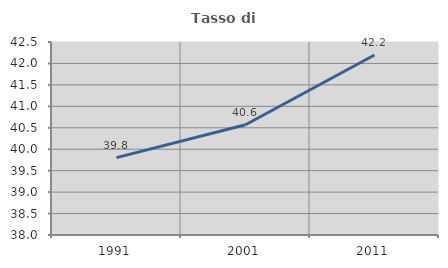
| Category | Tasso di occupazione   |
|---|---|
| 1991.0 | 39.803 |
| 2001.0 | 40.571 |
| 2011.0 | 42.197 |